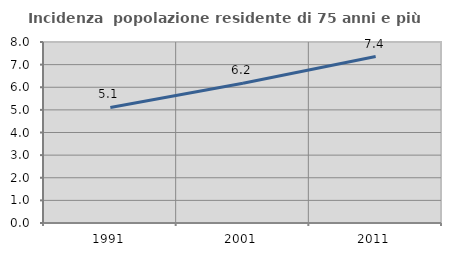
| Category | Incidenza  popolazione residente di 75 anni e più |
|---|---|
| 1991.0 | 5.108 |
| 2001.0 | 6.178 |
| 2011.0 | 7.358 |